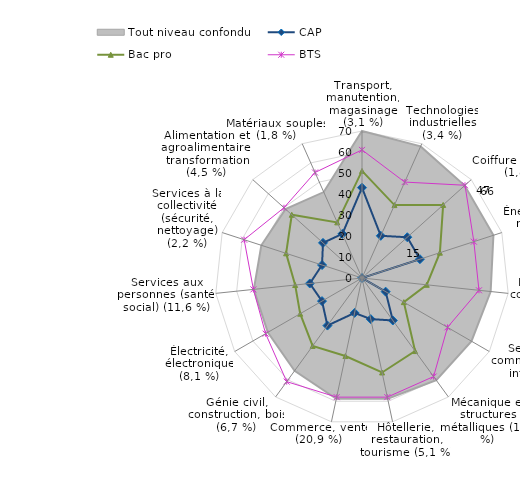
| Category | Tout niveau confondu |
|---|---|
| Transport, manutention, magasinage (3,1 %) | 50 |
| Technologies industrielles (3,4 %) | 49 |
| Coiffure esthétique (1,8 %) | 47 |
| Énergie, chimie, métallurgie (3,1 %) | 47 |
| Finances, comptabilité (11,4 %) | 44 |
| Secrétariat, communication et information (5,7 %) | 43 |
| Mécanique et structures métalliques (10,3 %) | 43 |
| Hôtellerie, restauration, tourisme (5,1 %) | 42 |
| Commerce, vente (20,9 %) | 42 |
| Génie civil, construction, bois (6,7 %) | 39 |
| Électricité, électronique (8,1 %) | 37 |
| Services aux personnes (santé, social) (11,6 %) | 37 |
| Services à la collectivité (sécurité, nettoyage) (2,2 %) | 36 |
| Alimentation et agroalimentaire, transformation (4,5 %) | 35 |
| Matériaux souples (1,8 %) | 32 |